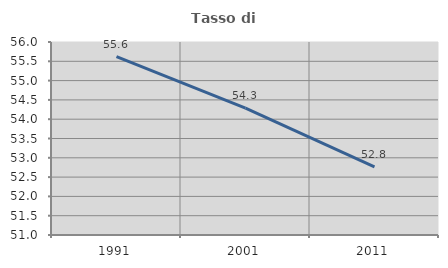
| Category | Tasso di occupazione   |
|---|---|
| 1991.0 | 55.619 |
| 2001.0 | 54.286 |
| 2011.0 | 52.767 |